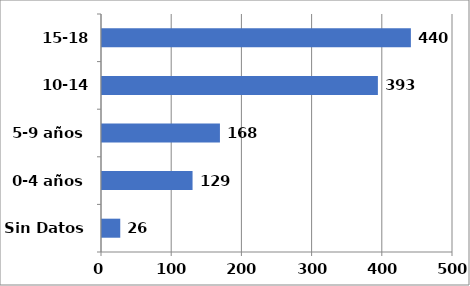
| Category | Series 0 |
|---|---|
| Sin Datos | 26 |
| 0-4 años | 129 |
| 5-9 años | 168 |
| 10-14 años | 393 |
| 15-18 años | 440 |